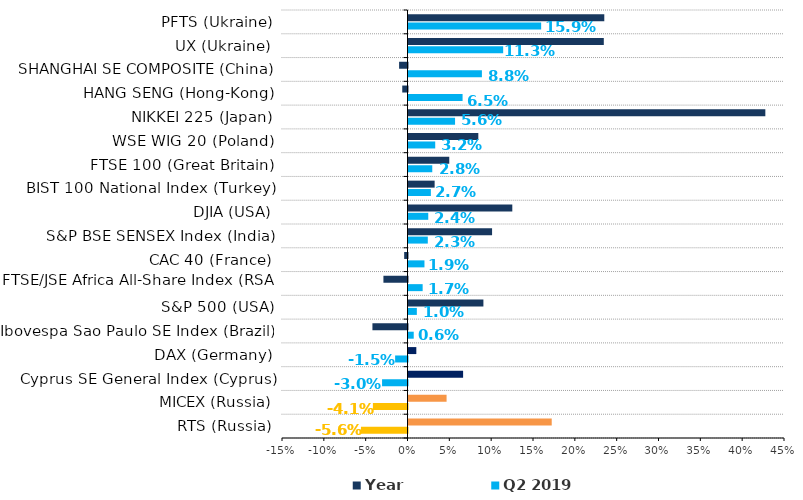
| Category | Q2 2019 | Year |
|---|---|---|
| RTS (Russia) | -0.056 | 0.171 |
| MICEX (Russia) | -0.041 | 0.046 |
| Cyprus SE General Index (Cyprus) | -0.03 | 0.065 |
| DAX (Germany) | -0.015 | 0.009 |
| Ibovespa Sao Paulo SE Index (Brazil) | 0.006 | -0.042 |
| S&P 500 (USA) | 0.01 | 0.09 |
| FTSE/JSE Africa All-Share Index (RSA) | 0.017 | -0.029 |
| CAC 40 (France) | 0.019 | -0.004 |
| S&P BSE SENSEX Index (India) | 0.023 | 0.1 |
| DJIA (USA) | 0.024 | 0.124 |
| BIST 100 National Index (Тurkey) | 0.027 | 0.031 |
| FTSE 100 (Great Britain) | 0.028 | 0.049 |
| WSE WIG 20 (Poland) | 0.032 | 0.083 |
| NIKKEI 225 (Japan) | 0.056 | 0.427 |
| HANG SENG (Hong-Kong) | 0.065 | -0.006 |
| SHANGHAI SE COMPOSITE (China) | 0.088 | -0.01 |
| UX (Ukraine) | 0.113 | 0.233 |
| PFTS (Ukraine) | 0.159 | 0.234 |